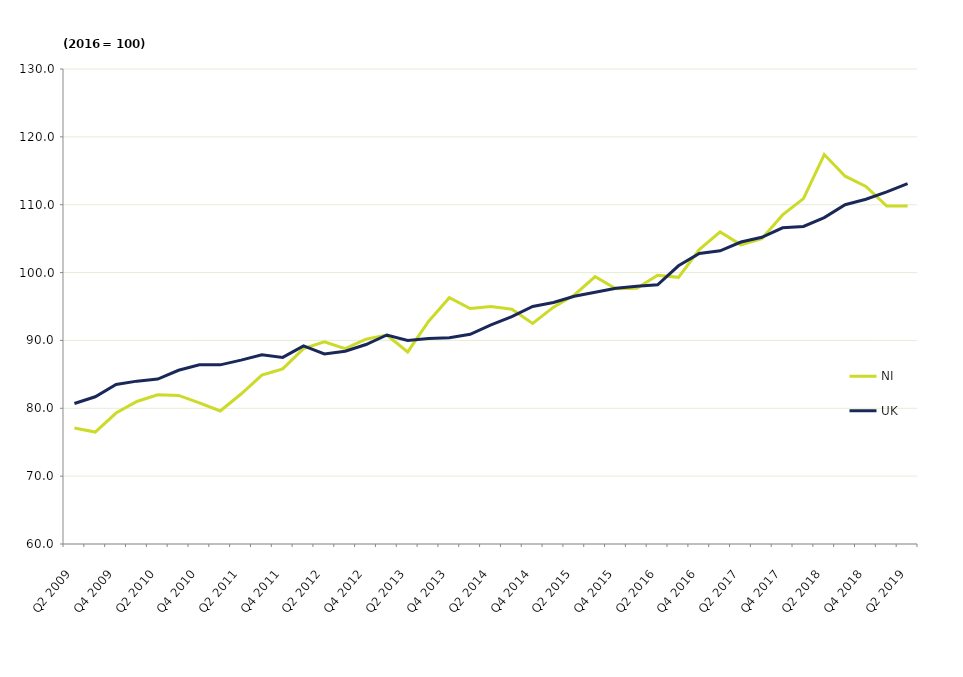
| Category | NI | UK |
|---|---|---|
| Q2 2009 | 77.1 | 80.7 |
| Q3 2009 | 76.5 | 81.7 |
| Q4 2009 | 79.3 | 83.5 |
| Q1 2010 | 81 | 84 |
| Q2 2010 | 82 | 84.3 |
| Q3 2010 | 81.9 | 85.6 |
| Q4 2010 | 80.8 | 86.4 |
| Q1 2011 | 79.6 | 86.4 |
| Q2 2011 | 82.1 | 87.1 |
| Q3 2011 | 84.9 | 87.9 |
| Q4 2011 | 85.8 | 87.5 |
| Q1 2012 | 88.8 | 89.2 |
| Q2 2012 | 89.8 | 88 |
| Q3 2012 | 88.8 | 88.4 |
| Q4 2012 | 90.2 | 89.4 |
| Q1 2013 | 90.8 | 90.8 |
| Q2 2013 | 88.3 | 90 |
| Q3 2013 | 92.8 | 90.3 |
| Q4 2013 | 96.3 | 90.4 |
| Q1 2014 | 94.7 | 90.9 |
| Q2 2014 | 95 | 92.3 |
| Q3 2014 | 94.6 | 93.5 |
| Q4 2014 | 92.5 | 95 |
| Q1 2015 | 94.9 | 95.6 |
| Q2 2015 | 96.7 | 96.5 |
| Q3 2015 | 99.4 | 97.1 |
| Q4 2015 | 97.6 | 97.7 |
| Q1 2016 | 97.7 | 98 |
| Q2 2016 | 99.6 | 98.2 |
| Q3 2016 | 99.3 | 101 |
| Q4 2016 | 103.4 | 102.8 |
| Q1 2017 | 106 | 103.2 |
| Q2 2017 | 104.1 | 104.5 |
| Q3 2017 | 105 | 105.2 |
| Q4 2017 | 108.5 | 106.6 |
| Q1 2018 | 110.9 | 106.8 |
| Q2 2018 | 117.4 | 108.1 |
| Q3 2018 | 114.2 | 110 |
| Q4 2018 | 112.7 | 110.8 |
| Q1 2019 | 109.8 | 111.9 |
| Q2 2019 | 109.8 | 113.1 |